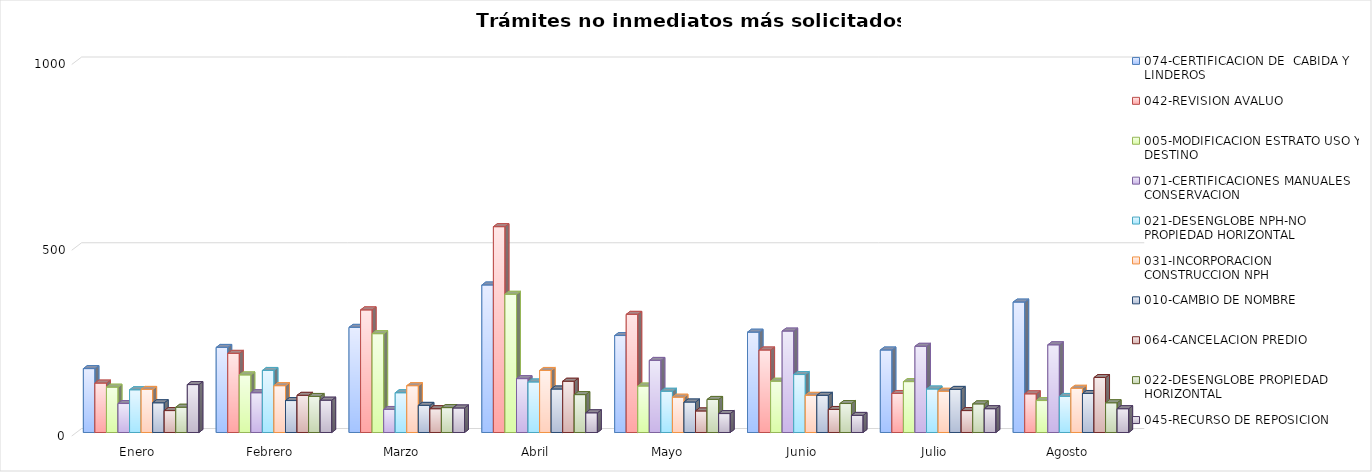
| Category | 074-CERTIFICACION DE  CABIDA Y LINDEROS  | 042-REVISION AVALUO | 005-MODIFICACION ESTRATO USO Y DESTINO | 071-CERTIFICACIONES MANUALES CONSERVACION | 021-DESENGLOBE NPH-NO PROPIEDAD HORIZONTAL | 031-INCORPORACION CONSTRUCCION NPH | 010-CAMBIO DE NOMBRE | 064-CANCELACION PREDIO | 022-DESENGLOBE PROPIEDAD HORIZONTAL | 045-RECURSO DE REPOSICION |
|---|---|---|---|---|---|---|---|---|---|---|
| Enero | 172 | 133 | 122 | 78 | 115 | 116 | 80 | 59 | 68 | 129 |
| Febrero | 229 | 213 | 155 | 107 | 167 | 126 | 86 | 100 | 97 | 87 |
| Marzo | 283 | 330 | 266 | 62 | 107 | 126 | 73 | 64 | 67 | 66 |
| Abril | 397 | 554 | 372 | 145 | 136 | 167 | 117 | 138 | 102 | 53 |
| Mayo | 261 | 318 | 125 | 194 | 111 | 95 | 82 | 58 | 89 | 51 |
| Junio | 270 | 222 | 138 | 273 | 156 | 100 | 100 | 62 | 78 | 46 |
| Julio | 222 | 105 | 137 | 232 | 117 | 111 | 116 | 59 | 77 | 64 |
| Agosto | 351 | 104 | 86 | 236 | 97 | 119 | 105 | 148 | 80 | 64 |